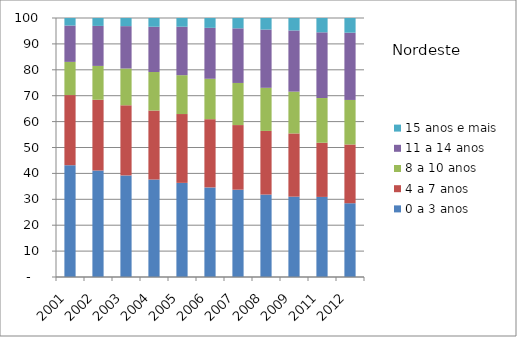
| Category | 0 a 3 anos | 4 a 7 anos | 8 a 10 anos | 11 a 14 anos | 15 anos e mais |
|---|---|---|---|---|---|
| 2001 | 43.17 | 27.07 | 12.82 | 14.03 | 2.91 |
| 2002 | 41.11 | 27.32 | 13.07 | 15.45 | 3.06 |
| 2003 | 39.22 | 27.08 | 14.2 | 16.36 | 3.13 |
| 2004 | 37.64 | 26.63 | 14.89 | 17.46 | 3.38 |
| 2005 | 36.34 | 26.58 | 15 | 18.72 | 3.36 |
| 2006 | 34.59 | 26.34 | 15.61 | 19.66 | 3.79 |
| 2007 | 33.71 | 24.95 | 16.26 | 21.09 | 3.99 |
| 2008 | 31.83 | 24.57 | 16.65 | 22.49 | 4.46 |
| 2009 | 31.02 | 24.41 | 16.14 | 23.62 | 4.81 |
| 2011 | 30.92 | 20.92 | 17.26 | 25.37 | 5.53 |
| 2012 | 28.48 | 22.68 | 17.2 | 25.97 | 5.67 |